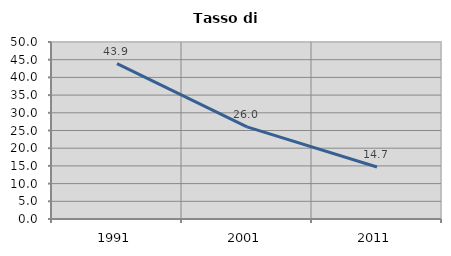
| Category | Tasso di disoccupazione   |
|---|---|
| 1991.0 | 43.898 |
| 2001.0 | 26.027 |
| 2011.0 | 14.673 |